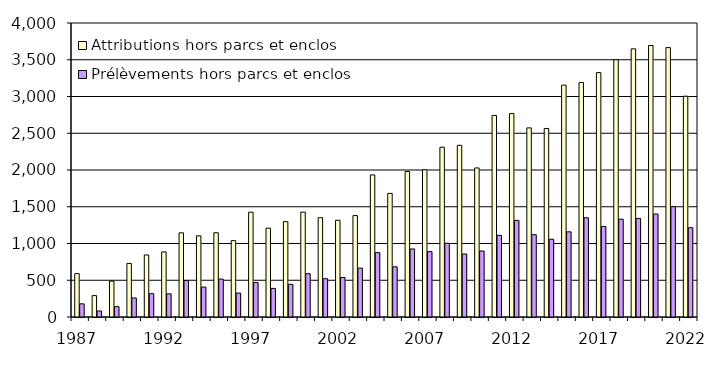
| Category | Attributions hors parcs et enclos | Prélèvements hors parcs et enclos |
|---|---|---|
| 1987.0 | 590 | 179 |
| 1988.0 | 291 | 82 |
| 1989.0 | 488 | 141 |
| 1990.0 | 729 | 259 |
| 1991.0 | 844 | 317 |
| 1992.0 | 886 | 315 |
| 1993.0 | 1145 | 497 |
| 1994.0 | 1104 | 407 |
| 1995.0 | 1146 | 516 |
| 1996.0 | 1039 | 325 |
| 1997.0 | 1426 | 469 |
| 1998.0 | 1209 | 389 |
| 1999.0 | 1297 | 445 |
| 2000.0 | 1427 | 589 |
| 2001.0 | 1351 | 521 |
| 2002.0 | 1316 | 537 |
| 2003.0 | 1380 | 665 |
| 2004.0 | 1933 | 876 |
| 2005.0 | 1682 | 683 |
| 2006.0 | 1980 | 925 |
| 2007.0 | 2003 | 890 |
| 2008.0 | 2310 | 1004 |
| 2009.0 | 2336 | 857 |
| 2010.0 | 2028 | 898 |
| 2011.0 | 2742 | 1111 |
| 2012.0 | 2768 | 1315 |
| 2013.0 | 2573 | 1120 |
| 2014.0 | 2565 | 1058 |
| 2015.0 | 3155 | 1159 |
| 2016.0 | 3190 | 1350 |
| 2017.0 | 3325 | 1231 |
| 2018.0 | 3500 | 1331 |
| 2019.0 | 3648 | 1341 |
| 2020.0 | 3694 | 1401 |
| 2021.0 | 3665 | 1501 |
| 2022.0 | 3004 | 1215 |